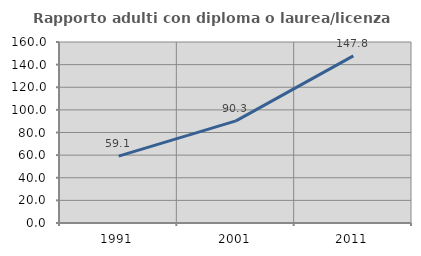
| Category | Rapporto adulti con diploma o laurea/licenza media  |
|---|---|
| 1991.0 | 59.091 |
| 2001.0 | 90.278 |
| 2011.0 | 147.761 |